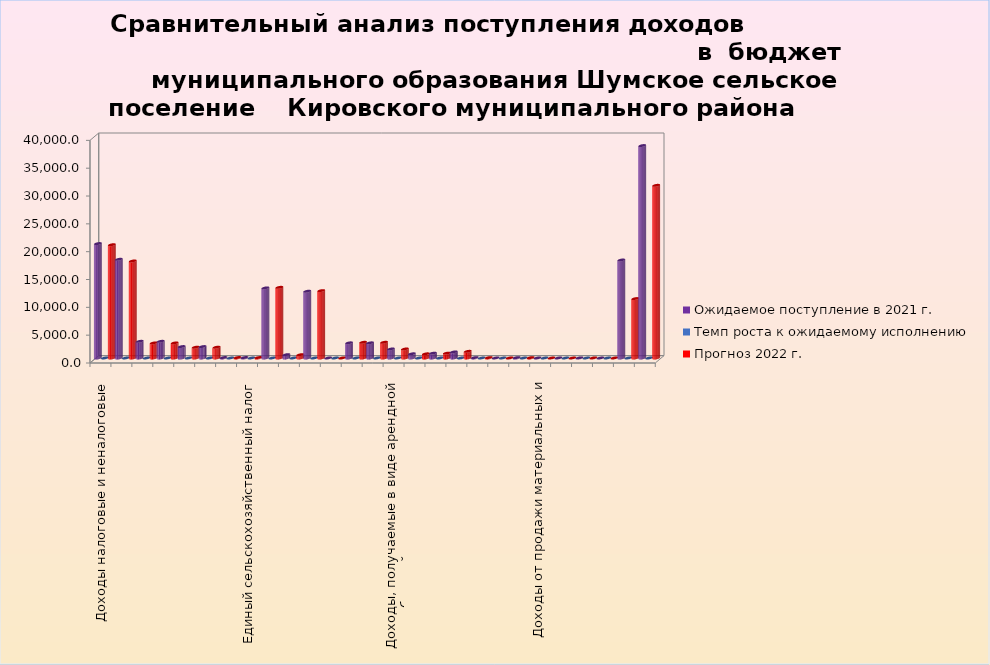
| Category | Ожидаемое поступление в 2021 г. | Темп роста к ожидаемому исполнению | Прогноз 2022 г. |
|---|---|---|---|
| Доходы налоговые и неналоговые | 20558.1 | 0.99 | 20351 |
| Налоговые доходы | 17738.3 | 0.983 | 17435.5 |
| Налоги на прибыль, доходы | 3000 | 0.904 | 2711.7 |
| Налог на доходы физических лиц | 3000 | 0.904 | 2711.7 |
| Налоги на товары (работы,услуги), реализуемые на территории РФ | 2052.3 | 0.946 | 1940.5 |
| Акцизы по подакцизным товарам (продукции), производимым на территории РФ | 2052.3 | 0.946 | 1940.5 |
| Налоги на совокупный доход | 80 | 1 | 80 |
| Единый сельскохозяйственный налог | 80 | 1 | 80 |
| Налог на имущество | 12600 | 1.008 | 12698.3 |
| Налог на имущество физических лиц | 600 | 0.983 | 590 |
| Земельный налог | 12000 | 1.009 | 12108.3 |
| Государственная пошлина | 6 | 0.833 | 5 |
| Неналоговые доходы | 2724.4 | 1.037 | 2825.5 |
| Доходы от использования имущества, находящегося в государственной и муниципальной собственности | 2724.4 | 1.037 | 2825.5 |
| Доходы, получаемые в виде арендной либо иной платы за передачу в возмездное пользование государственного и муниципального имущества      (за исключением имущества бюджетных и  автономных учреждений, а также имущества государственных и муниципальных унитар | 1624.4 | 1.001 | 1625.5 |
| арендная плата за земельные участки | 756 | 0.993 | 751 |
|  аренда имущества | 868.4 | 1.007 | 874.5 |
| Прочие доходы от использования имущества и прав, находящихся в государственной и муниципальной собственности (за исключением имущества бюджетных и автономных  учреждений, а также имущества государственных и муниципальных унитарных предприятий, в том числе | 1100 | 1.091 | 1200 |
| Доходы от оказания платных услуг  и компенсации затрат государства | 70 | 1 | 70 |
| Доходы от оказания платных услуг  | 5 | 2 | 10 |
| Доходы от компенсации затрат государства | 65 | 0.923 | 60 |
| Доходы от продажи материальных и нематериальных активов | 7.2 | 0 | 0 |
| Доходы от продажи земельных участков, находящихся в государственной и муниципальной собственности (за искл. земельных участков бюджетных и автономных учреждений) | 7.2 | 0 | 0 |
| Штрафы, санкции, возмещение ущерба | 18.2 | 1.099 | 20 |
| Прочие неналоговые доходы | 0 | 0 | 0 |
| Безвозмездные поступления | 17608.2 | 0.606 | 10675.6 |
| Всего  доходов | 38166.3 | 0.813 | 31026.6 |